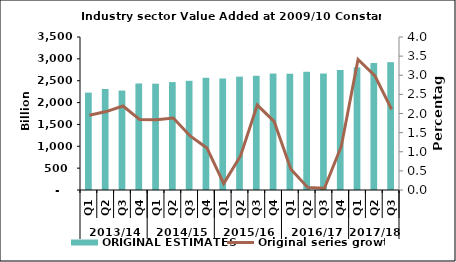
| Category | ORIGINAL ESTIMATES |
|---|---|
| 0 | 2227.126 |
| 1 | 2310.459 |
| 2 | 2275.017 |
| 3 | 2436.805 |
| 4 | 2432.811 |
| 5 | 2468.619 |
| 6 | 2498.165 |
| 7 | 2566.979 |
| 8 | 2551.067 |
| 9 | 2592.903 |
| 10 | 2612.693 |
| 11 | 2663.651 |
| 12 | 2659.459 |
| 13 | 2704.937 |
| 14 | 2664.601 |
| 15 | 2745.225 |
| 16 | 2804.944 |
| 17 | 2906.276 |
| 18 | 2923.529 |